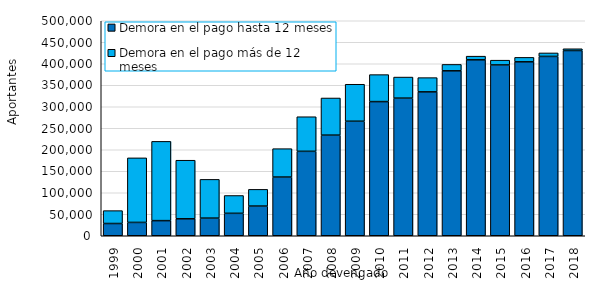
| Category | Demora en el pago hasta 12 meses | Demora en el pago más de 12 meses |
|---|---|---|
| 1999.0 | 28465 | 29982 |
| 2000.0 | 31003 | 150129 |
| 2001.0 | 35168 | 184345 |
| 2002.0 | 39441 | 136226 |
| 2003.0 | 40990 | 90134 |
| 2004.0 | 52176 | 41463 |
| 2005.0 | 69015 | 38902 |
| 2006.0 | 136495 | 66036 |
| 2007.0 | 196342 | 80439 |
| 2008.0 | 234000 | 86376 |
| 2009.0 | 266330 | 86026 |
| 2010.0 | 311990 | 62776 |
| 2011.0 | 320041 | 49029 |
| 2012.0 | 334618 | 33144 |
| 2013.0 | 383568 | 14875 |
| 2014.0 | 409141 | 8554 |
| 2015.0 | 397246 | 11082 |
| 2016.0 | 404470 | 10390 |
| 2017.0 | 417051 | 8105 |
| 2018.0 | 430812 | 4066 |